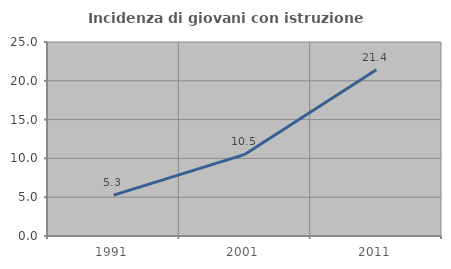
| Category | Incidenza di giovani con istruzione universitaria |
|---|---|
| 1991.0 | 5.263 |
| 2001.0 | 10.526 |
| 2011.0 | 21.429 |